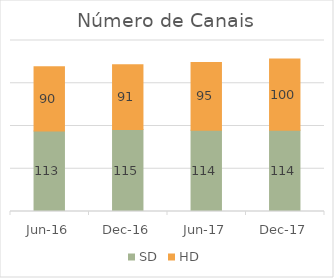
| Category | SD | HD |
|---|---|---|
| 2016-06-01 | 113 | 90 |
| 2016-12-01 | 115 | 91 |
| 2017-06-01 | 114 | 95 |
| 2017-12-01 | 114 | 100 |